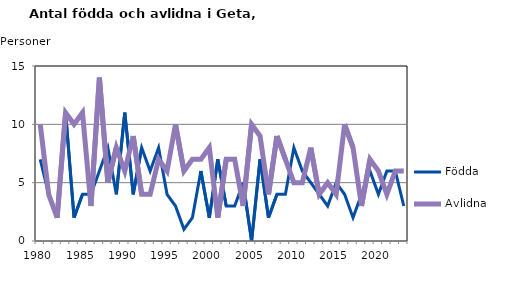
| Category | Födda | Avlidna |
|---|---|---|
| 1980.0 | 7 | 10 |
| 1981.0 | 4 | 4 |
| 1982.0 | 2 | 2 |
| 1983.0 | 11 | 11 |
| 1984.0 | 2 | 10 |
| 1985.0 | 4 | 11 |
| 1986.0 | 4 | 3 |
| 1987.0 | 6 | 14 |
| 1988.0 | 8 | 5 |
| 1989.0 | 4 | 8 |
| 1990.0 | 11 | 6 |
| 1991.0 | 4 | 9 |
| 1992.0 | 8 | 4 |
| 1993.0 | 6 | 4 |
| 1994.0 | 8 | 7 |
| 1995.0 | 4 | 6 |
| 1996.0 | 3 | 10 |
| 1997.0 | 1 | 6 |
| 1998.0 | 2 | 7 |
| 1999.0 | 6 | 7 |
| 2000.0 | 2 | 8 |
| 2001.0 | 7 | 2 |
| 2002.0 | 3 | 7 |
| 2003.0 | 3 | 7 |
| 2004.0 | 5 | 3 |
| 2005.0 | 0 | 10 |
| 2006.0 | 7 | 9 |
| 2007.0 | 2 | 4 |
| 2008.0 | 4 | 9 |
| 2009.0 | 4 | 7 |
| 2010.0 | 8 | 5 |
| 2011.0 | 6 | 5 |
| 2012.0 | 5 | 8 |
| 2013.0 | 4 | 4 |
| 2014.0 | 3 | 5 |
| 2015.0 | 5 | 4 |
| 2016.0 | 4 | 10 |
| 2017.0 | 2 | 8 |
| 2018.0 | 4 | 3 |
| 2019.0 | 6 | 7 |
| 2020.0 | 4 | 6 |
| 2021.0 | 6 | 4 |
| 2022.0 | 6 | 6 |
| 2023.0 | 3 | 6 |